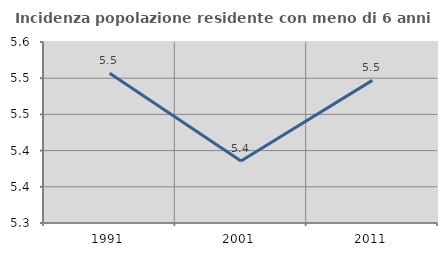
| Category | Incidenza popolazione residente con meno di 6 anni |
|---|---|
| 1991.0 | 5.507 |
| 2001.0 | 5.386 |
| 2011.0 | 5.497 |